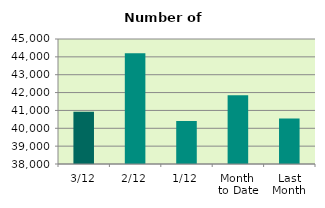
| Category | Series 0 |
|---|---|
| 3/12 | 40928 |
| 2/12 | 44198 |
| 1/12 | 40414 |
| Month 
to Date | 41846.667 |
| Last
Month | 40546.091 |